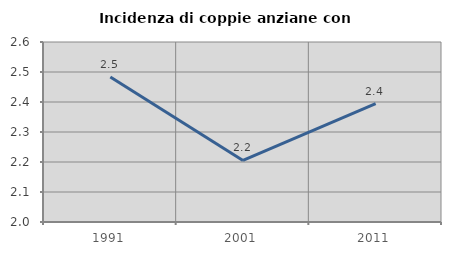
| Category | Incidenza di coppie anziane con figli |
|---|---|
| 1991.0 | 2.484 |
| 2001.0 | 2.205 |
| 2011.0 | 2.395 |